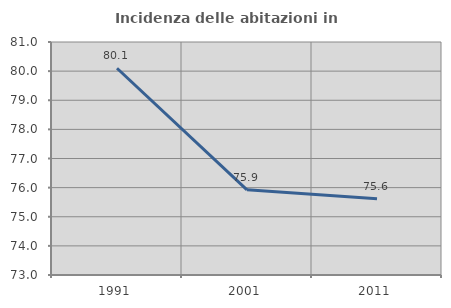
| Category | Incidenza delle abitazioni in proprietà  |
|---|---|
| 1991.0 | 80.1 |
| 2001.0 | 75.926 |
| 2011.0 | 75.62 |